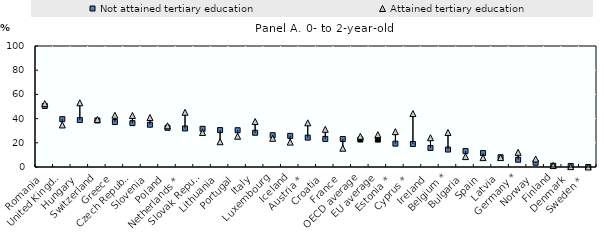
| Category | Not attained tertiary education | Attained tertiary education |
|---|---|---|
| Romania | 50.441 | 52.4 |
| United Kingdom | 39.554 | 34.751 |
| Hungary | 38.814 | 53.078 |
| Switzerland | 38.459 | 39.271 |
| Greece | 37.192 | 42.749 |
| Czech Republic | 36.262 | 42.623 |
| Slovenia | 34.942 | 40.873 |
| Poland | 32.388 | 34.051 |
| Netherlands * | 31.838 | 45.244 |
| Slovak Republic | 31.581 | 28.551 |
| Lithuania | 30.518 | 20.862 |
| Portugal | 30.387 | 25.389 |
| Italy | 28.298 | 37.565 |
| Luxembourg | 26.287 | 23.691 |
| Iceland | 25.726 | 20.567 |
| Austria * | 24.283 | 36.511 |
| Croatia | 23.209 | 31.109 |
| France | 23.142 | 15.505 |
| OECD average | 22.698 | 25.345 |
| EU average | 22.644 | 26.7 |
| Estonia * | 19.326 | 29.222 |
| Cyprus * | 19.041 | 44.177 |
| Ireland | 15.751 | 24.191 |
| Belgium * | 14.425 | 28.538 |
| Bulgaria | 13.159 | 8.597 |
| Spain | 11.526 | 7.738 |
| Latvia | 8.04 | 7.777 |
| Germany * | 5.993 | 12.115 |
| Norway | 3.512 | 6.633 |
| Finland | 1.037 | 1.173 |
| Denmark | 0.859 | 0.307 |
| Sweden * | 0 | 0 |